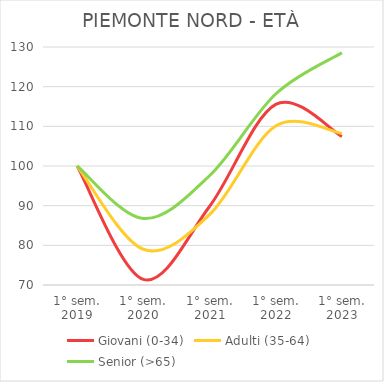
| Category | Giovani (0-34) | Adulti (35-64) | Senior (>65) |
|---|---|---|---|
| 1° sem.
2019 | 100 | 100 | 100 |
| 1° sem.
2020 | 71.406 | 79.006 | 86.767 |
| 1° sem.
2021 | 89.791 | 87.726 | 97.543 |
| 1° sem.
2022 | 115.55 | 110.081 | 118.147 |
| 1° sem.
2023 | 107.443 | 108.181 | 128.544 |